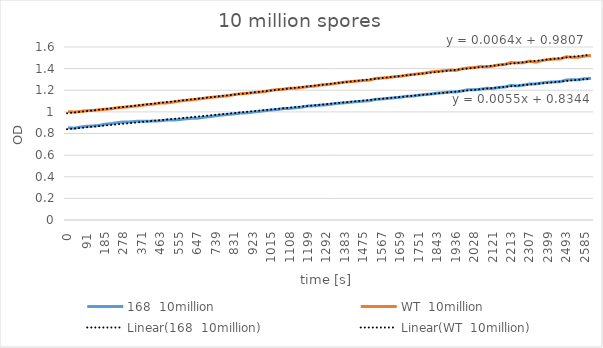
| Category | 168  10million | WT  10million |
|---|---|---|
| 0.0 | 0.853 | 1.003 |
| 30.0 | 0.849 | 0.998 |
| 61.0 | 0.86 | 1.004 |
| 91.0 | 0.866 | 1.011 |
| 122.0 | 0.87 | 1.013 |
| 153.0 | 0.874 | 1.019 |
| 185.0 | 0.886 | 1.024 |
| 216.0 | 0.891 | 1.029 |
| 246.0 | 0.9 | 1.038 |
| 278.0 | 0.907 | 1.043 |
| 309.0 | 0.907 | 1.048 |
| 341.0 | 0.912 | 1.054 |
| 371.0 | 0.914 | 1.061 |
| 402.0 | 0.913 | 1.068 |
| 432.0 | 0.916 | 1.072 |
| 463.0 | 0.917 | 1.082 |
| 494.0 | 0.924 | 1.083 |
| 525.0 | 0.924 | 1.09 |
| 555.0 | 0.928 | 1.099 |
| 586.0 | 0.935 | 1.106 |
| 617.0 | 0.94 | 1.111 |
| 647.0 | 0.941 | 1.118 |
| 678.0 | 0.95 | 1.125 |
| 708.0 | 0.956 | 1.133 |
| 739.0 | 0.964 | 1.138 |
| 770.0 | 0.971 | 1.144 |
| 800.0 | 0.976 | 1.149 |
| 831.0 | 0.981 | 1.16 |
| 862.0 | 0.989 | 1.167 |
| 893.0 | 0.991 | 1.171 |
| 923.0 | 0.998 | 1.177 |
| 954.0 | 1.004 | 1.182 |
| 985.0 | 1.011 | 1.188 |
| 1015.0 | 1.017 | 1.199 |
| 1046.0 | 1.022 | 1.206 |
| 1076.0 | 1.03 | 1.209 |
| 1108.0 | 1.032 | 1.219 |
| 1139.0 | 1.038 | 1.219 |
| 1169.0 | 1.044 | 1.226 |
| 1199.0 | 1.054 | 1.234 |
| 1230.0 | 1.056 | 1.238 |
| 1261.0 | 1.062 | 1.248 |
| 1292.0 | 1.066 | 1.252 |
| 1323.0 | 1.073 | 1.259 |
| 1353.0 | 1.08 | 1.268 |
| 1383.0 | 1.084 | 1.275 |
| 1414.0 | 1.09 | 1.28 |
| 1444.0 | 1.095 | 1.285 |
| 1475.0 | 1.099 | 1.29 |
| 1505.0 | 1.104 | 1.294 |
| 1536.0 | 1.116 | 1.309 |
| 1567.0 | 1.119 | 1.313 |
| 1598.0 | 1.125 | 1.317 |
| 1629.0 | 1.13 | 1.325 |
| 1659.0 | 1.135 | 1.329 |
| 1690.0 | 1.144 | 1.339 |
| 1720.0 | 1.146 | 1.346 |
| 1751.0 | 1.154 | 1.352 |
| 1782.0 | 1.16 | 1.358 |
| 1813.0 | 1.165 | 1.369 |
| 1843.0 | 1.173 | 1.375 |
| 1874.0 | 1.177 | 1.379 |
| 1905.0 | 1.183 | 1.386 |
| 1936.0 | 1.184 | 1.383 |
| 1967.0 | 1.193 | 1.398 |
| 1997.0 | 1.205 | 1.406 |
| 2028.0 | 1.204 | 1.41 |
| 2059.0 | 1.209 | 1.419 |
| 2090.0 | 1.218 | 1.417 |
| 2121.0 | 1.216 | 1.423 |
| 2151.0 | 1.226 | 1.434 |
| 2182.0 | 1.23 | 1.439 |
| 2213.0 | 1.245 | 1.456 |
| 2244.0 | 1.24 | 1.453 |
| 2276.0 | 1.248 | 1.455 |
| 2307.0 | 1.257 | 1.469 |
| 2337.0 | 1.259 | 1.46 |
| 2368.0 | 1.267 | 1.474 |
| 2399.0 | 1.274 | 1.484 |
| 2431.0 | 1.277 | 1.489 |
| 2462.0 | 1.279 | 1.489 |
| 2493.0 | 1.295 | 1.51 |
| 2523.0 | 1.297 | 1.505 |
| 2554.0 | 1.298 | 1.506 |
| 2585.0 | 1.307 | 1.516 |
| 2616.0 | 1.308 | 1.522 |